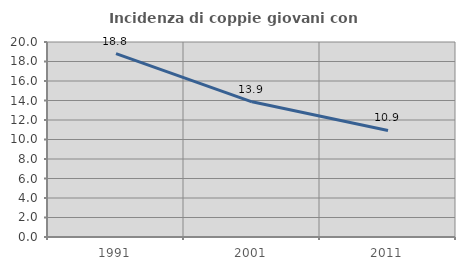
| Category | Incidenza di coppie giovani con figli |
|---|---|
| 1991.0 | 18.812 |
| 2001.0 | 13.864 |
| 2011.0 | 10.929 |